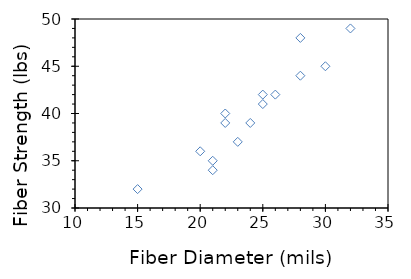
| Category | Series 0 |
|---|---|
| 20.0 | 36 |
| 25.0 | 41 |
| 24.0 | 39 |
| 25.0 | 42 |
| 32.0 | 49 |
| 22.0 | 40 |
| 28.0 | 48 |
| 22.0 | 39 |
| 30.0 | 45 |
| 28.0 | 44 |
| 21.0 | 35 |
| 23.0 | 37 |
| 26.0 | 42 |
| 21.0 | 34 |
| 15.0 | 32 |